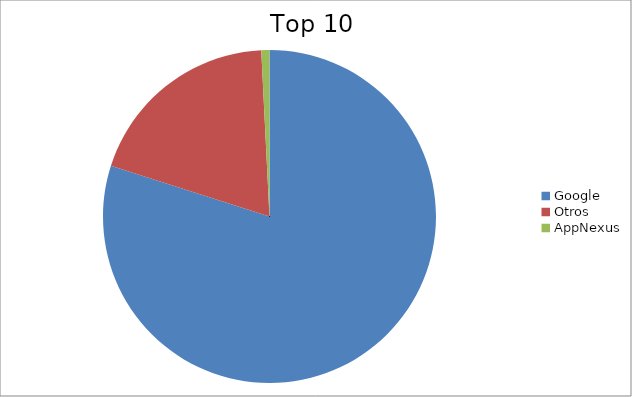
| Category | Series 0 |
|---|---|
| Google | 79.93 |
| Otros | 19.28 |
| AppNexus | 0.79 |